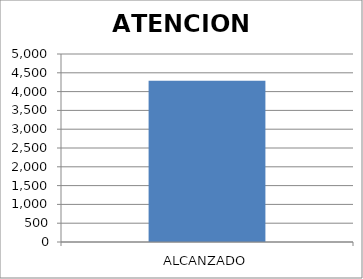
| Category | ATENCION BRINDADA |
|---|---|
| ALCANZADO | 4289 |